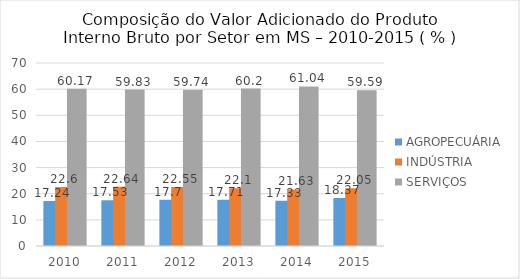
| Category | AGROPECUÁRIA | INDÚSTRIA | SERVIÇOS |
|---|---|---|---|
| 2010.0 | 17.24 | 22.6 | 60.17 |
| 2011.0 | 17.53 | 22.64 | 59.83 |
| 2012.0 | 17.7 | 22.55 | 59.74 |
| 2013.0 | 17.71 | 22.1 | 60.2 |
| 2014.0 | 17.33 | 21.63 | 61.04 |
| 2015.0 | 18.37 | 22.05 | 59.59 |